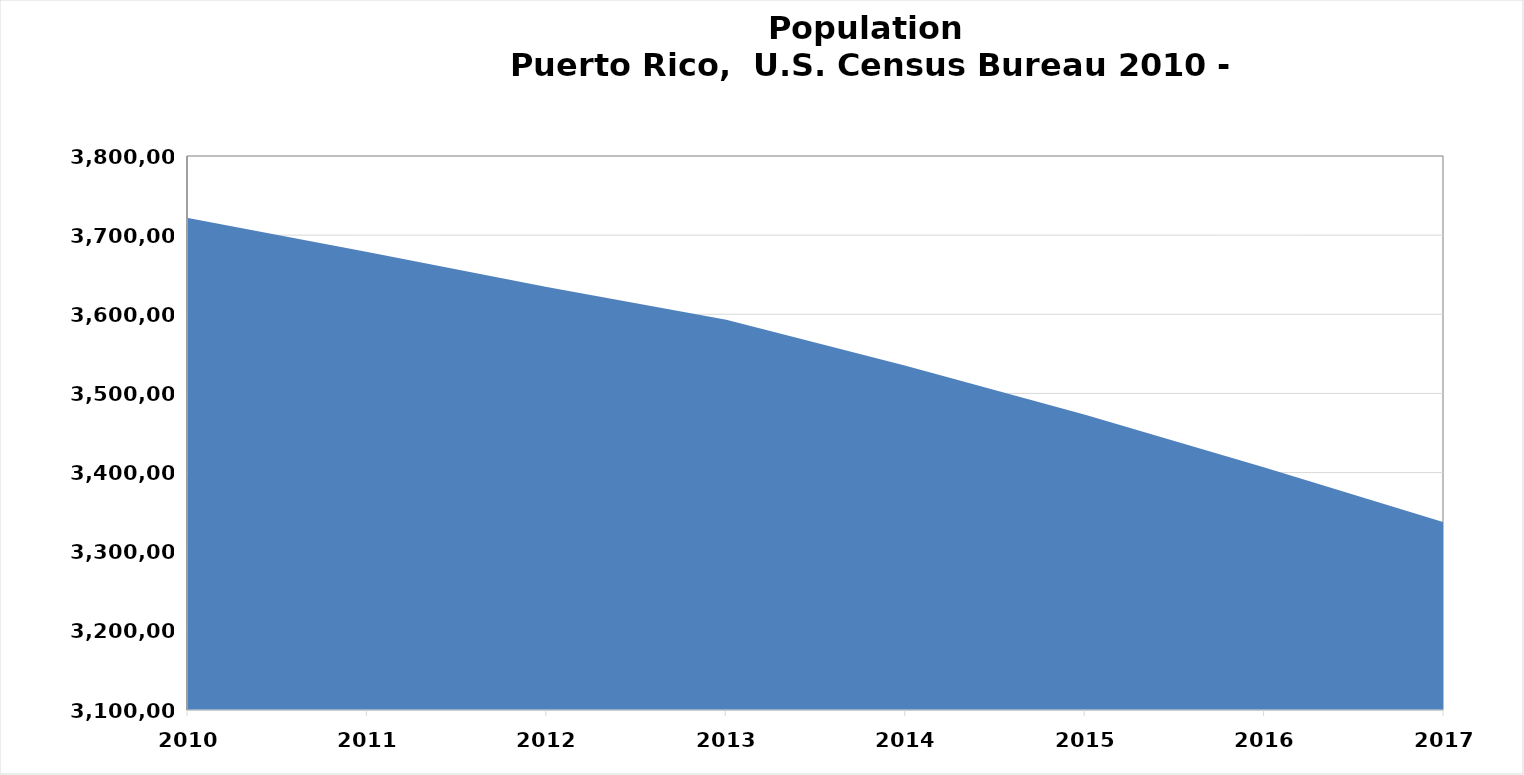
| Category | Series 0 |
|---|---|
| 2010.0 | 3721525 |
| 2011.0 | 3678732 |
| 2012.0 | 3634488 |
| 2013.0 | 3593077 |
| 2014.0 | 3534874 |
| 2015.0 | 3473177 |
| 2016.0 | 3406520 |
| 2017.0 | 3337177 |